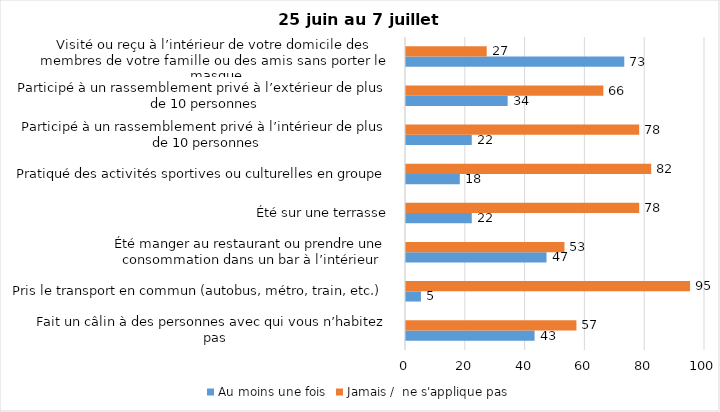
| Category | Au moins une fois | Jamais /  ne s'applique pas |
|---|---|---|
| Fait un câlin à des personnes avec qui vous n’habitez pas | 43 | 57 |
| Pris le transport en commun (autobus, métro, train, etc.) | 5 | 95 |
| Été manger au restaurant ou prendre une consommation dans un bar à l’intérieur | 47 | 53 |
| Été sur une terrasse | 22 | 78 |
| Pratiqué des activités sportives ou culturelles en groupe | 18 | 82 |
| Participé à un rassemblement privé à l’intérieur de plus de 10 personnes | 22 | 78 |
| Participé à un rassemblement privé à l’extérieur de plus de 10 personnes | 34 | 66 |
| Visité ou reçu à l’intérieur de votre domicile des membres de votre famille ou des amis sans porter le masque | 73 | 27 |